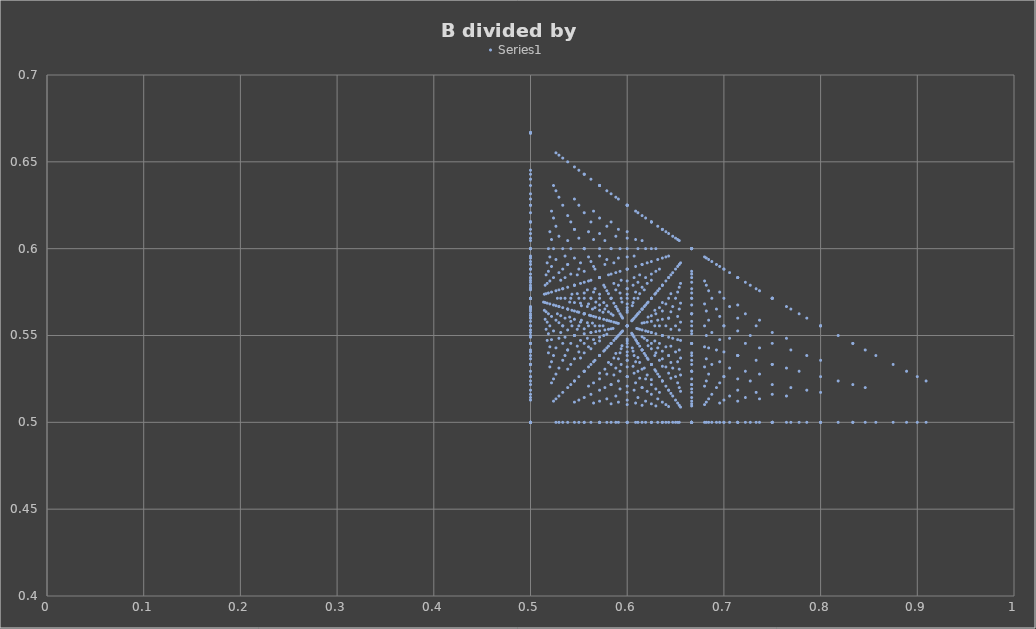
| Category | Series 0 |
|---|---|
| 0.5 | 0.667 |
| 0.6666666666666666 | 0.6 |
| 0.75 | 0.571 |
| 0.8 | 0.556 |
| 0.8333333333333334 | 0.545 |
| 0.8571428571428571 | 0.538 |
| 0.875 | 0.533 |
| 0.8888888888888888 | 0.529 |
| 0.9 | 0.526 |
| 0.9090909090909091 | 0.524 |
| 0.5 | 0.667 |
| 0.6 | 0.625 |
| 0.6666666666666666 | 0.6 |
| 0.7142857142857143 | 0.583 |
| 0.75 | 0.571 |
| 0.7777777777777778 | 0.562 |
| 0.8 | 0.556 |
| 0.8181818181818182 | 0.55 |
| 0.8333333333333334 | 0.545 |
| 0.8461538461538461 | 0.542 |
| 0.5 | 0.667 |
| 0.5714285714285714 | 0.636 |
| 0.625 | 0.615 |
| 0.6666666666666666 | 0.6 |
| 0.7 | 0.588 |
| 0.7272727272727273 | 0.579 |
| 0.75 | 0.571 |
| 0.7692307692307693 | 0.565 |
| 0.7857142857142857 | 0.56 |
| 0.8 | 0.556 |
| 0.5 | 0.667 |
| 0.5555555555555556 | 0.643 |
| 0.6 | 0.625 |
| 0.6363636363636364 | 0.611 |
| 0.6666666666666666 | 0.6 |
| 0.6923076923076923 | 0.591 |
| 0.7142857142857143 | 0.583 |
| 0.7333333333333333 | 0.577 |
| 0.75 | 0.571 |
| 0.7647058823529411 | 0.567 |
| 0.5 | 0.667 |
| 0.5454545454545454 | 0.647 |
| 0.5833333333333334 | 0.632 |
| 0.6153846153846154 | 0.619 |
| 0.6428571428571429 | 0.609 |
| 0.6666666666666666 | 0.6 |
| 0.6875 | 0.593 |
| 0.7058823529411765 | 0.586 |
| 0.7222222222222222 | 0.581 |
| 0.7368421052631579 | 0.576 |
| 0.5 | 0.667 |
| 0.5384615384615384 | 0.65 |
| 0.5714285714285714 | 0.636 |
| 0.6 | 0.625 |
| 0.625 | 0.615 |
| 0.6470588235294118 | 0.607 |
| 0.6666666666666666 | 0.6 |
| 0.6842105263157895 | 0.594 |
| 0.7 | 0.588 |
| 0.7142857142857143 | 0.583 |
| 0.5 | 0.667 |
| 0.5333333333333333 | 0.652 |
| 0.5625 | 0.64 |
| 0.5882352941176471 | 0.63 |
| 0.6111111111111112 | 0.621 |
| 0.631578947368421 | 0.613 |
| 0.65 | 0.606 |
| 0.6666666666666666 | 0.6 |
| 0.6818181818181818 | 0.595 |
| 0.6956521739130435 | 0.59 |
| 0.5 | 0.667 |
| 0.5294117647058824 | 0.654 |
| 0.5555555555555556 | 0.643 |
| 0.5789473684210527 | 0.633 |
| 0.6 | 0.625 |
| 0.6190476190476191 | 0.618 |
| 0.6363636363636364 | 0.611 |
| 0.6521739130434783 | 0.605 |
| 0.6666666666666666 | 0.6 |
| 0.68 | 0.595 |
| 0.5 | 0.667 |
| 0.5263157894736842 | 0.655 |
| 0.55 | 0.645 |
| 0.5714285714285714 | 0.636 |
| 0.5909090909090909 | 0.629 |
| 0.6086956521739131 | 0.622 |
| 0.625 | 0.615 |
| 0.64 | 0.61 |
| 0.6538461538461539 | 0.605 |
| 0.6666666666666666 | 0.6 |
| 0.5 | 0.5 |
| 0.6666666666666666 | 0.5 |
| 0.75 | 0.5 |
| 0.8 | 0.5 |
| 0.8333333333333334 | 0.5 |
| 0.8571428571428571 | 0.5 |
| 0.875 | 0.5 |
| 0.8888888888888888 | 0.5 |
| 0.9 | 0.5 |
| 0.9090909090909091 | 0.5 |
| 0.5 | 0.571 |
| 0.6 | 0.556 |
| 0.6666666666666666 | 0.545 |
| 0.7142857142857143 | 0.538 |
| 0.75 | 0.533 |
| 0.7777777777777778 | 0.529 |
| 0.8 | 0.526 |
| 0.8181818181818182 | 0.524 |
| 0.8333333333333334 | 0.522 |
| 0.8461538461538461 | 0.52 |
| 0.5 | 0.6 |
| 0.5714285714285714 | 0.583 |
| 0.625 | 0.571 |
| 0.6666666666666666 | 0.562 |
| 0.7 | 0.556 |
| 0.7272727272727273 | 0.55 |
| 0.75 | 0.545 |
| 0.7692307692307693 | 0.542 |
| 0.7857142857142857 | 0.538 |
| 0.8 | 0.536 |
| 0.5 | 0.615 |
| 0.5555555555555556 | 0.6 |
| 0.6 | 0.588 |
| 0.6363636363636364 | 0.579 |
| 0.6666666666666666 | 0.571 |
| 0.6923076923076923 | 0.565 |
| 0.7142857142857143 | 0.56 |
| 0.7333333333333333 | 0.556 |
| 0.75 | 0.552 |
| 0.7647058823529411 | 0.548 |
| 0.5 | 0.625 |
| 0.5454545454545454 | 0.611 |
| 0.5833333333333334 | 0.6 |
| 0.6153846153846154 | 0.591 |
| 0.6428571428571429 | 0.583 |
| 0.6666666666666666 | 0.577 |
| 0.6875 | 0.571 |
| 0.7058823529411765 | 0.567 |
| 0.7222222222222222 | 0.562 |
| 0.7368421052631579 | 0.559 |
| 0.5 | 0.632 |
| 0.5384615384615384 | 0.619 |
| 0.5714285714285714 | 0.609 |
| 0.6 | 0.6 |
| 0.625 | 0.593 |
| 0.6470588235294118 | 0.586 |
| 0.6666666666666666 | 0.581 |
| 0.6842105263157895 | 0.576 |
| 0.7 | 0.571 |
| 0.7142857142857143 | 0.568 |
| 0.5 | 0.636 |
| 0.5333333333333333 | 0.625 |
| 0.5625 | 0.615 |
| 0.5882352941176471 | 0.607 |
| 0.6111111111111112 | 0.6 |
| 0.631578947368421 | 0.594 |
| 0.65 | 0.588 |
| 0.6666666666666666 | 0.583 |
| 0.6818181818181818 | 0.579 |
| 0.6956521739130435 | 0.575 |
| 0.5 | 0.64 |
| 0.5294117647058824 | 0.63 |
| 0.5555555555555556 | 0.621 |
| 0.5789473684210527 | 0.613 |
| 0.6 | 0.606 |
| 0.6190476190476191 | 0.6 |
| 0.6363636363636364 | 0.595 |
| 0.6521739130434783 | 0.59 |
| 0.6666666666666666 | 0.585 |
| 0.68 | 0.581 |
| 0.5 | 0.643 |
| 0.5263157894736842 | 0.633 |
| 0.55 | 0.625 |
| 0.5714285714285714 | 0.618 |
| 0.5909090909090909 | 0.611 |
| 0.6086956521739131 | 0.605 |
| 0.625 | 0.6 |
| 0.64 | 0.595 |
| 0.6538461538461539 | 0.591 |
| 0.6666666666666666 | 0.587 |
| 0.5 | 0.645 |
| 0.5238095238095238 | 0.636 |
| 0.5454545454545454 | 0.629 |
| 0.5652173913043478 | 0.622 |
| 0.5833333333333334 | 0.615 |
| 0.6 | 0.61 |
| 0.6153846153846154 | 0.605 |
| 0.6296296296296297 | 0.6 |
| 0.6428571428571429 | 0.596 |
| 0.6551724137931034 | 0.592 |
| 0.5 | 0.5 |
| 0.6 | 0.5 |
| 0.6666666666666666 | 0.5 |
| 0.7142857142857143 | 0.5 |
| 0.75 | 0.5 |
| 0.7777777777777778 | 0.5 |
| 0.8 | 0.5 |
| 0.8181818181818182 | 0.5 |
| 0.8333333333333334 | 0.5 |
| 0.8461538461538461 | 0.5 |
| 0.5 | 0.545 |
| 0.5714285714285714 | 0.538 |
| 0.625 | 0.533 |
| 0.6666666666666666 | 0.529 |
| 0.7 | 0.526 |
| 0.7272727272727273 | 0.524 |
| 0.75 | 0.522 |
| 0.7692307692307693 | 0.52 |
| 0.7857142857142857 | 0.519 |
| 0.8 | 0.517 |
| 0.5 | 0.571 |
| 0.5555555555555556 | 0.562 |
| 0.6 | 0.556 |
| 0.6363636363636364 | 0.55 |
| 0.6666666666666666 | 0.545 |
| 0.6923076923076923 | 0.542 |
| 0.7142857142857143 | 0.538 |
| 0.7333333333333333 | 0.536 |
| 0.75 | 0.533 |
| 0.7647058823529411 | 0.531 |
| 0.5 | 0.588 |
| 0.5454545454545454 | 0.579 |
| 0.5833333333333334 | 0.571 |
| 0.6153846153846154 | 0.565 |
| 0.6428571428571429 | 0.56 |
| 0.6666666666666666 | 0.556 |
| 0.6875 | 0.552 |
| 0.7058823529411765 | 0.548 |
| 0.7222222222222222 | 0.545 |
| 0.7368421052631579 | 0.543 |
| 0.5 | 0.6 |
| 0.5384615384615384 | 0.591 |
| 0.5714285714285714 | 0.583 |
| 0.6 | 0.577 |
| 0.625 | 0.571 |
| 0.6470588235294118 | 0.567 |
| 0.6666666666666666 | 0.562 |
| 0.6842105263157895 | 0.559 |
| 0.7 | 0.556 |
| 0.7142857142857143 | 0.553 |
| 0.5 | 0.609 |
| 0.5333333333333333 | 0.6 |
| 0.5625 | 0.593 |
| 0.5882352941176471 | 0.586 |
| 0.6111111111111112 | 0.581 |
| 0.631578947368421 | 0.576 |
| 0.65 | 0.571 |
| 0.6666666666666666 | 0.568 |
| 0.6818181818181818 | 0.564 |
| 0.6956521739130435 | 0.561 |
| 0.5 | 0.615 |
| 0.5294117647058824 | 0.607 |
| 0.5555555555555556 | 0.6 |
| 0.5789473684210527 | 0.594 |
| 0.6 | 0.588 |
| 0.6190476190476191 | 0.583 |
| 0.6363636363636364 | 0.579 |
| 0.6521739130434783 | 0.575 |
| 0.6666666666666666 | 0.571 |
| 0.68 | 0.568 |
| 0.5 | 0.621 |
| 0.5263157894736842 | 0.613 |
| 0.55 | 0.606 |
| 0.5714285714285714 | 0.6 |
| 0.5909090909090909 | 0.595 |
| 0.6086956521739131 | 0.59 |
| 0.625 | 0.585 |
| 0.64 | 0.581 |
| 0.6538461538461539 | 0.578 |
| 0.6666666666666666 | 0.574 |
| 0.5 | 0.625 |
| 0.5238095238095238 | 0.618 |
| 0.5454545454545454 | 0.611 |
| 0.5652173913043478 | 0.605 |
| 0.5833333333333334 | 0.6 |
| 0.6 | 0.595 |
| 0.6153846153846154 | 0.591 |
| 0.6296296296296297 | 0.587 |
| 0.6428571428571429 | 0.583 |
| 0.6551724137931034 | 0.58 |
| 0.5 | 0.629 |
| 0.5217391304347826 | 0.622 |
| 0.5416666666666666 | 0.615 |
| 0.56 | 0.61 |
| 0.5769230769230769 | 0.605 |
| 0.5925925925925926 | 0.6 |
| 0.6071428571428571 | 0.596 |
| 0.6206896551724138 | 0.592 |
| 0.6333333333333333 | 0.588 |
| 0.6451612903225806 | 0.585 |
| 0.5 | 0.5 |
| 0.5714285714285714 | 0.5 |
| 0.625 | 0.5 |
| 0.6666666666666666 | 0.5 |
| 0.7 | 0.5 |
| 0.7272727272727273 | 0.5 |
| 0.75 | 0.5 |
| 0.7692307692307693 | 0.5 |
| 0.7857142857142857 | 0.5 |
| 0.8 | 0.5 |
| 0.5 | 0.533 |
| 0.5555555555555556 | 0.529 |
| 0.6 | 0.526 |
| 0.6363636363636364 | 0.524 |
| 0.6666666666666666 | 0.522 |
| 0.6923076923076923 | 0.52 |
| 0.7142857142857143 | 0.519 |
| 0.7333333333333333 | 0.517 |
| 0.75 | 0.516 |
| 0.7647058823529411 | 0.515 |
| 0.5 | 0.556 |
| 0.5454545454545454 | 0.55 |
| 0.5833333333333334 | 0.545 |
| 0.6153846153846154 | 0.542 |
| 0.6428571428571429 | 0.538 |
| 0.6666666666666666 | 0.536 |
| 0.6875 | 0.533 |
| 0.7058823529411765 | 0.531 |
| 0.7222222222222222 | 0.529 |
| 0.7368421052631579 | 0.528 |
| 0.5 | 0.571 |
| 0.5384615384615384 | 0.565 |
| 0.5714285714285714 | 0.56 |
| 0.6 | 0.556 |
| 0.625 | 0.552 |
| 0.6470588235294118 | 0.548 |
| 0.6666666666666666 | 0.545 |
| 0.6842105263157895 | 0.543 |
| 0.7 | 0.541 |
| 0.7142857142857143 | 0.538 |
| 0.5 | 0.583 |
| 0.5333333333333333 | 0.577 |
| 0.5625 | 0.571 |
| 0.5882352941176471 | 0.567 |
| 0.6111111111111112 | 0.562 |
| 0.631578947368421 | 0.559 |
| 0.65 | 0.556 |
| 0.6666666666666666 | 0.553 |
| 0.6818181818181818 | 0.55 |
| 0.6956521739130435 | 0.548 |
| 0.5 | 0.593 |
| 0.5294117647058824 | 0.586 |
| 0.5555555555555556 | 0.581 |
| 0.5789473684210527 | 0.576 |
| 0.6 | 0.571 |
| 0.6190476190476191 | 0.568 |
| 0.6363636363636364 | 0.564 |
| 0.6521739130434783 | 0.561 |
| 0.6666666666666666 | 0.558 |
| 0.68 | 0.556 |
| 0.5 | 0.6 |
| 0.5263157894736842 | 0.594 |
| 0.55 | 0.588 |
| 0.5714285714285714 | 0.583 |
| 0.5909090909090909 | 0.579 |
| 0.6086956521739131 | 0.575 |
| 0.625 | 0.571 |
| 0.64 | 0.568 |
| 0.6538461538461539 | 0.565 |
| 0.6666666666666666 | 0.562 |
| 0.5 | 0.606 |
| 0.5238095238095238 | 0.6 |
| 0.5454545454545454 | 0.595 |
| 0.5652173913043478 | 0.59 |
| 0.5833333333333334 | 0.585 |
| 0.6 | 0.581 |
| 0.6153846153846154 | 0.578 |
| 0.6296296296296297 | 0.574 |
| 0.6428571428571429 | 0.571 |
| 0.6551724137931034 | 0.569 |
| 0.5 | 0.611 |
| 0.5217391304347826 | 0.605 |
| 0.5416666666666666 | 0.6 |
| 0.56 | 0.595 |
| 0.5769230769230769 | 0.591 |
| 0.5925925925925926 | 0.587 |
| 0.6071428571428571 | 0.583 |
| 0.6206896551724138 | 0.58 |
| 0.6333333333333333 | 0.577 |
| 0.6451612903225806 | 0.574 |
| 0.5 | 0.615 |
| 0.52 | 0.61 |
| 0.5384615384615384 | 0.605 |
| 0.5555555555555556 | 0.6 |
| 0.5714285714285714 | 0.596 |
| 0.5862068965517241 | 0.592 |
| 0.6 | 0.588 |
| 0.6129032258064516 | 0.585 |
| 0.625 | 0.582 |
| 0.6363636363636364 | 0.579 |
| 0.5 | 0.5 |
| 0.5555555555555556 | 0.5 |
| 0.6 | 0.5 |
| 0.6363636363636364 | 0.5 |
| 0.6666666666666666 | 0.5 |
| 0.6923076923076923 | 0.5 |
| 0.7142857142857143 | 0.5 |
| 0.7333333333333333 | 0.5 |
| 0.75 | 0.5 |
| 0.7647058823529411 | 0.5 |
| 0.5 | 0.526 |
| 0.5454545454545454 | 0.524 |
| 0.5833333333333334 | 0.522 |
| 0.6153846153846154 | 0.52 |
| 0.6428571428571429 | 0.519 |
| 0.6666666666666666 | 0.517 |
| 0.6875 | 0.516 |
| 0.7058823529411765 | 0.515 |
| 0.7222222222222222 | 0.514 |
| 0.7368421052631579 | 0.514 |
| 0.5 | 0.545 |
| 0.5384615384615384 | 0.542 |
| 0.5714285714285714 | 0.538 |
| 0.6 | 0.536 |
| 0.625 | 0.533 |
| 0.6470588235294118 | 0.531 |
| 0.6666666666666666 | 0.529 |
| 0.6842105263157895 | 0.528 |
| 0.7 | 0.526 |
| 0.7142857142857143 | 0.525 |
| 0.5 | 0.56 |
| 0.5333333333333333 | 0.556 |
| 0.5625 | 0.552 |
| 0.5882352941176471 | 0.548 |
| 0.6111111111111112 | 0.545 |
| 0.631578947368421 | 0.543 |
| 0.65 | 0.541 |
| 0.6666666666666666 | 0.538 |
| 0.6818181818181818 | 0.537 |
| 0.6956521739130435 | 0.535 |
| 0.5 | 0.571 |
| 0.5294117647058824 | 0.567 |
| 0.5555555555555556 | 0.562 |
| 0.5789473684210527 | 0.559 |
| 0.6 | 0.556 |
| 0.6190476190476191 | 0.553 |
| 0.6363636363636364 | 0.55 |
| 0.6521739130434783 | 0.548 |
| 0.6666666666666666 | 0.545 |
| 0.68 | 0.543 |
| 0.5 | 0.581 |
| 0.5263157894736842 | 0.576 |
| 0.55 | 0.571 |
| 0.5714285714285714 | 0.568 |
| 0.5909090909090909 | 0.564 |
| 0.6086956521739131 | 0.561 |
| 0.625 | 0.558 |
| 0.64 | 0.556 |
| 0.6538461538461539 | 0.553 |
| 0.6666666666666666 | 0.551 |
| 0.5 | 0.588 |
| 0.5238095238095238 | 0.583 |
| 0.5454545454545454 | 0.579 |
| 0.5652173913043478 | 0.575 |
| 0.5833333333333334 | 0.571 |
| 0.6 | 0.568 |
| 0.6153846153846154 | 0.565 |
| 0.6296296296296297 | 0.562 |
| 0.6428571428571429 | 0.56 |
| 0.6551724137931034 | 0.558 |
| 0.5 | 0.595 |
| 0.5217391304347826 | 0.59 |
| 0.5416666666666666 | 0.585 |
| 0.56 | 0.581 |
| 0.5769230769230769 | 0.578 |
| 0.5925925925925926 | 0.574 |
| 0.6071428571428571 | 0.571 |
| 0.6206896551724138 | 0.569 |
| 0.6333333333333333 | 0.566 |
| 0.6451612903225806 | 0.564 |
| 0.5 | 0.6 |
| 0.52 | 0.595 |
| 0.5384615384615384 | 0.591 |
| 0.5555555555555556 | 0.587 |
| 0.5714285714285714 | 0.583 |
| 0.5862068965517241 | 0.58 |
| 0.6 | 0.577 |
| 0.6129032258064516 | 0.574 |
| 0.625 | 0.571 |
| 0.6363636363636364 | 0.569 |
| 0.5 | 0.605 |
| 0.5185185185185185 | 0.6 |
| 0.5357142857142857 | 0.596 |
| 0.5517241379310345 | 0.592 |
| 0.5666666666666667 | 0.588 |
| 0.5806451612903226 | 0.585 |
| 0.59375 | 0.582 |
| 0.6060606060606061 | 0.579 |
| 0.6176470588235294 | 0.576 |
| 0.6285714285714286 | 0.574 |
| 0.5 | 0.5 |
| 0.5454545454545454 | 0.5 |
| 0.5833333333333334 | 0.5 |
| 0.6153846153846154 | 0.5 |
| 0.6428571428571429 | 0.5 |
| 0.6666666666666666 | 0.5 |
| 0.6875 | 0.5 |
| 0.7058823529411765 | 0.5 |
| 0.7222222222222222 | 0.5 |
| 0.7368421052631579 | 0.5 |
| 0.5 | 0.522 |
| 0.5384615384615384 | 0.52 |
| 0.5714285714285714 | 0.519 |
| 0.6 | 0.517 |
| 0.625 | 0.516 |
| 0.6470588235294118 | 0.515 |
| 0.6666666666666666 | 0.514 |
| 0.6842105263157895 | 0.514 |
| 0.7 | 0.513 |
| 0.7142857142857143 | 0.512 |
| 0.5 | 0.538 |
| 0.5333333333333333 | 0.536 |
| 0.5625 | 0.533 |
| 0.5882352941176471 | 0.531 |
| 0.6111111111111112 | 0.529 |
| 0.631578947368421 | 0.528 |
| 0.65 | 0.526 |
| 0.6666666666666666 | 0.525 |
| 0.6818181818181818 | 0.524 |
| 0.6956521739130435 | 0.523 |
| 0.5 | 0.552 |
| 0.5294117647058824 | 0.548 |
| 0.5555555555555556 | 0.545 |
| 0.5789473684210527 | 0.543 |
| 0.6 | 0.541 |
| 0.6190476190476191 | 0.538 |
| 0.6363636363636364 | 0.537 |
| 0.6521739130434783 | 0.535 |
| 0.6666666666666666 | 0.533 |
| 0.68 | 0.532 |
| 0.5 | 0.562 |
| 0.5263157894736842 | 0.559 |
| 0.55 | 0.556 |
| 0.5714285714285714 | 0.553 |
| 0.5909090909090909 | 0.55 |
| 0.6086956521739131 | 0.548 |
| 0.625 | 0.545 |
| 0.64 | 0.543 |
| 0.6538461538461539 | 0.542 |
| 0.6666666666666666 | 0.54 |
| 0.5 | 0.571 |
| 0.5238095238095238 | 0.568 |
| 0.5454545454545454 | 0.564 |
| 0.5652173913043478 | 0.561 |
| 0.5833333333333334 | 0.558 |
| 0.6 | 0.556 |
| 0.6153846153846154 | 0.553 |
| 0.6296296296296297 | 0.551 |
| 0.6428571428571429 | 0.549 |
| 0.6551724137931034 | 0.547 |
| 0.5 | 0.579 |
| 0.5217391304347826 | 0.575 |
| 0.5416666666666666 | 0.571 |
| 0.56 | 0.568 |
| 0.5769230769230769 | 0.565 |
| 0.5925925925925926 | 0.562 |
| 0.6071428571428571 | 0.56 |
| 0.6206896551724138 | 0.558 |
| 0.6333333333333333 | 0.556 |
| 0.6451612903225806 | 0.554 |
| 0.5 | 0.585 |
| 0.52 | 0.581 |
| 0.5384615384615384 | 0.578 |
| 0.5555555555555556 | 0.574 |
| 0.5714285714285714 | 0.571 |
| 0.5862068965517241 | 0.569 |
| 0.6 | 0.566 |
| 0.6129032258064516 | 0.564 |
| 0.625 | 0.561 |
| 0.6363636363636364 | 0.559 |
| 0.5 | 0.591 |
| 0.5185185185185185 | 0.587 |
| 0.5357142857142857 | 0.583 |
| 0.5517241379310345 | 0.58 |
| 0.5666666666666667 | 0.577 |
| 0.5806451612903226 | 0.574 |
| 0.59375 | 0.571 |
| 0.6060606060606061 | 0.569 |
| 0.6176470588235294 | 0.567 |
| 0.6285714285714286 | 0.565 |
| 0.5 | 0.596 |
| 0.5172413793103449 | 0.592 |
| 0.5333333333333333 | 0.588 |
| 0.5483870967741935 | 0.585 |
| 0.5625 | 0.582 |
| 0.5757575757575758 | 0.579 |
| 0.5882352941176471 | 0.576 |
| 0.6 | 0.574 |
| 0.6111111111111112 | 0.571 |
| 0.6216216216216216 | 0.569 |
| 0.5 | 0.5 |
| 0.5384615384615384 | 0.5 |
| 0.5714285714285714 | 0.5 |
| 0.6 | 0.5 |
| 0.625 | 0.5 |
| 0.6470588235294118 | 0.5 |
| 0.6666666666666666 | 0.5 |
| 0.6842105263157895 | 0.5 |
| 0.7 | 0.5 |
| 0.7142857142857143 | 0.5 |
| 0.5 | 0.519 |
| 0.5333333333333333 | 0.517 |
| 0.5625 | 0.516 |
| 0.5882352941176471 | 0.515 |
| 0.6111111111111112 | 0.514 |
| 0.631578947368421 | 0.514 |
| 0.65 | 0.513 |
| 0.6666666666666666 | 0.512 |
| 0.6818181818181818 | 0.512 |
| 0.6956521739130435 | 0.511 |
| 0.5 | 0.533 |
| 0.5294117647058824 | 0.531 |
| 0.5555555555555556 | 0.529 |
| 0.5789473684210527 | 0.528 |
| 0.6 | 0.526 |
| 0.6190476190476191 | 0.525 |
| 0.6363636363636364 | 0.524 |
| 0.6521739130434783 | 0.523 |
| 0.6666666666666666 | 0.522 |
| 0.68 | 0.521 |
| 0.5 | 0.545 |
| 0.5263157894736842 | 0.543 |
| 0.55 | 0.541 |
| 0.5714285714285714 | 0.538 |
| 0.5909090909090909 | 0.537 |
| 0.6086956521739131 | 0.535 |
| 0.625 | 0.533 |
| 0.64 | 0.532 |
| 0.6538461538461539 | 0.531 |
| 0.6666666666666666 | 0.529 |
| 0.5 | 0.556 |
| 0.5238095238095238 | 0.553 |
| 0.5454545454545454 | 0.55 |
| 0.5652173913043478 | 0.548 |
| 0.5833333333333334 | 0.545 |
| 0.6 | 0.543 |
| 0.6153846153846154 | 0.542 |
| 0.6296296296296297 | 0.54 |
| 0.6428571428571429 | 0.538 |
| 0.6551724137931034 | 0.537 |
| 0.5 | 0.564 |
| 0.5217391304347826 | 0.561 |
| 0.5416666666666666 | 0.558 |
| 0.56 | 0.556 |
| 0.5769230769230769 | 0.553 |
| 0.5925925925925926 | 0.551 |
| 0.6071428571428571 | 0.549 |
| 0.6206896551724138 | 0.547 |
| 0.6333333333333333 | 0.545 |
| 0.6451612903225806 | 0.544 |
| 0.5 | 0.571 |
| 0.52 | 0.568 |
| 0.5384615384615384 | 0.565 |
| 0.5555555555555556 | 0.562 |
| 0.5714285714285714 | 0.56 |
| 0.5862068965517241 | 0.558 |
| 0.6 | 0.556 |
| 0.6129032258064516 | 0.554 |
| 0.625 | 0.552 |
| 0.6363636363636364 | 0.55 |
| 0.5 | 0.578 |
| 0.5185185185185185 | 0.574 |
| 0.5357142857142857 | 0.571 |
| 0.5517241379310345 | 0.569 |
| 0.5666666666666667 | 0.566 |
| 0.5806451612903226 | 0.564 |
| 0.59375 | 0.561 |
| 0.6060606060606061 | 0.559 |
| 0.6176470588235294 | 0.557 |
| 0.6285714285714286 | 0.556 |
| 0.5 | 0.583 |
| 0.5172413793103449 | 0.58 |
| 0.5333333333333333 | 0.577 |
| 0.5483870967741935 | 0.574 |
| 0.5625 | 0.571 |
| 0.5757575757575758 | 0.569 |
| 0.5882352941176471 | 0.567 |
| 0.6 | 0.565 |
| 0.6111111111111112 | 0.562 |
| 0.6216216216216216 | 0.561 |
| 0.5 | 0.588 |
| 0.5161290322580645 | 0.585 |
| 0.53125 | 0.582 |
| 0.5454545454545454 | 0.579 |
| 0.5588235294117647 | 0.576 |
| 0.5714285714285714 | 0.574 |
| 0.5833333333333334 | 0.571 |
| 0.5945945945945946 | 0.569 |
| 0.6052631578947368 | 0.567 |
| 0.6153846153846154 | 0.565 |
| 0.5 | 0.5 |
| 0.5333333333333333 | 0.5 |
| 0.5625 | 0.5 |
| 0.5882352941176471 | 0.5 |
| 0.6111111111111112 | 0.5 |
| 0.631578947368421 | 0.5 |
| 0.65 | 0.5 |
| 0.6666666666666666 | 0.5 |
| 0.6818181818181818 | 0.5 |
| 0.6956521739130435 | 0.5 |
| 0.5 | 0.516 |
| 0.5294117647058824 | 0.515 |
| 0.5555555555555556 | 0.514 |
| 0.5789473684210527 | 0.514 |
| 0.6 | 0.513 |
| 0.6190476190476191 | 0.512 |
| 0.6363636363636364 | 0.512 |
| 0.6521739130434783 | 0.511 |
| 0.6666666666666666 | 0.511 |
| 0.68 | 0.51 |
| 0.5 | 0.529 |
| 0.5263157894736842 | 0.528 |
| 0.55 | 0.526 |
| 0.5714285714285714 | 0.525 |
| 0.5909090909090909 | 0.524 |
| 0.6086956521739131 | 0.523 |
| 0.625 | 0.522 |
| 0.64 | 0.521 |
| 0.6538461538461539 | 0.52 |
| 0.6666666666666666 | 0.519 |
| 0.5 | 0.541 |
| 0.5238095238095238 | 0.538 |
| 0.5454545454545454 | 0.537 |
| 0.5652173913043478 | 0.535 |
| 0.5833333333333334 | 0.533 |
| 0.6 | 0.532 |
| 0.6153846153846154 | 0.531 |
| 0.6296296296296297 | 0.529 |
| 0.6428571428571429 | 0.528 |
| 0.6551724137931034 | 0.527 |
| 0.5 | 0.55 |
| 0.5217391304347826 | 0.548 |
| 0.5416666666666666 | 0.545 |
| 0.56 | 0.543 |
| 0.5769230769230769 | 0.542 |
| 0.5925925925925926 | 0.54 |
| 0.6071428571428571 | 0.538 |
| 0.6206896551724138 | 0.537 |
| 0.6333333333333333 | 0.536 |
| 0.6451612903225806 | 0.534 |
| 0.5 | 0.558 |
| 0.52 | 0.556 |
| 0.5384615384615384 | 0.553 |
| 0.5555555555555556 | 0.551 |
| 0.5714285714285714 | 0.549 |
| 0.5862068965517241 | 0.547 |
| 0.6 | 0.545 |
| 0.6129032258064516 | 0.544 |
| 0.625 | 0.542 |
| 0.6363636363636364 | 0.541 |
| 0.5 | 0.565 |
| 0.5185185185185185 | 0.562 |
| 0.5357142857142857 | 0.56 |
| 0.5517241379310345 | 0.558 |
| 0.5666666666666667 | 0.556 |
| 0.5806451612903226 | 0.554 |
| 0.59375 | 0.552 |
| 0.6060606060606061 | 0.55 |
| 0.6176470588235294 | 0.548 |
| 0.6285714285714286 | 0.547 |
| 0.5 | 0.571 |
| 0.5172413793103449 | 0.569 |
| 0.5333333333333333 | 0.566 |
| 0.5483870967741935 | 0.564 |
| 0.5625 | 0.561 |
| 0.5757575757575758 | 0.559 |
| 0.5882352941176471 | 0.557 |
| 0.6 | 0.556 |
| 0.6111111111111112 | 0.554 |
| 0.6216216216216216 | 0.552 |
| 0.5 | 0.577 |
| 0.5161290322580645 | 0.574 |
| 0.53125 | 0.571 |
| 0.5454545454545454 | 0.569 |
| 0.5588235294117647 | 0.567 |
| 0.5714285714285714 | 0.565 |
| 0.5833333333333334 | 0.562 |
| 0.5945945945945946 | 0.561 |
| 0.6052631578947368 | 0.559 |
| 0.6153846153846154 | 0.557 |
| 0.5 | 0.582 |
| 0.5151515151515151 | 0.579 |
| 0.5294117647058824 | 0.576 |
| 0.5428571428571428 | 0.574 |
| 0.5555555555555556 | 0.571 |
| 0.5675675675675675 | 0.569 |
| 0.5789473684210527 | 0.567 |
| 0.5897435897435898 | 0.565 |
| 0.6 | 0.563 |
| 0.6097560975609756 | 0.562 |
| 0.5 | 0.5 |
| 0.5294117647058824 | 0.5 |
| 0.5555555555555556 | 0.5 |
| 0.5789473684210527 | 0.5 |
| 0.6 | 0.5 |
| 0.6190476190476191 | 0.5 |
| 0.6363636363636364 | 0.5 |
| 0.6521739130434783 | 0.5 |
| 0.6666666666666666 | 0.5 |
| 0.68 | 0.5 |
| 0.5 | 0.514 |
| 0.5263157894736842 | 0.514 |
| 0.55 | 0.513 |
| 0.5714285714285714 | 0.512 |
| 0.5909090909090909 | 0.512 |
| 0.6086956521739131 | 0.511 |
| 0.625 | 0.511 |
| 0.64 | 0.51 |
| 0.6538461538461539 | 0.51 |
| 0.6666666666666666 | 0.509 |
| 0.5 | 0.526 |
| 0.5238095238095238 | 0.525 |
| 0.5454545454545454 | 0.524 |
| 0.5652173913043478 | 0.523 |
| 0.5833333333333334 | 0.522 |
| 0.6 | 0.521 |
| 0.6153846153846154 | 0.52 |
| 0.6296296296296297 | 0.519 |
| 0.6428571428571429 | 0.519 |
| 0.6551724137931034 | 0.518 |
| 0.5 | 0.537 |
| 0.5217391304347826 | 0.535 |
| 0.5416666666666666 | 0.533 |
| 0.56 | 0.532 |
| 0.5769230769230769 | 0.531 |
| 0.5925925925925926 | 0.529 |
| 0.6071428571428571 | 0.528 |
| 0.6206896551724138 | 0.527 |
| 0.6333333333333333 | 0.526 |
| 0.6451612903225806 | 0.525 |
| 0.5 | 0.545 |
| 0.52 | 0.543 |
| 0.5384615384615384 | 0.542 |
| 0.5555555555555556 | 0.54 |
| 0.5714285714285714 | 0.538 |
| 0.5862068965517241 | 0.537 |
| 0.6 | 0.536 |
| 0.6129032258064516 | 0.534 |
| 0.625 | 0.533 |
| 0.6363636363636364 | 0.532 |
| 0.5 | 0.553 |
| 0.5185185185185185 | 0.551 |
| 0.5357142857142857 | 0.549 |
| 0.5517241379310345 | 0.547 |
| 0.5666666666666667 | 0.545 |
| 0.5806451612903226 | 0.544 |
| 0.59375 | 0.542 |
| 0.6060606060606061 | 0.541 |
| 0.6176470588235294 | 0.54 |
| 0.6285714285714286 | 0.538 |
| 0.5 | 0.56 |
| 0.5172413793103449 | 0.558 |
| 0.5333333333333333 | 0.556 |
| 0.5483870967741935 | 0.554 |
| 0.5625 | 0.552 |
| 0.5757575757575758 | 0.55 |
| 0.5882352941176471 | 0.548 |
| 0.6 | 0.547 |
| 0.6111111111111112 | 0.545 |
| 0.6216216216216216 | 0.544 |
| 0.5 | 0.566 |
| 0.5161290322580645 | 0.564 |
| 0.53125 | 0.561 |
| 0.5454545454545454 | 0.559 |
| 0.5588235294117647 | 0.557 |
| 0.5714285714285714 | 0.556 |
| 0.5833333333333334 | 0.554 |
| 0.5945945945945946 | 0.552 |
| 0.6052631578947368 | 0.551 |
| 0.6153846153846154 | 0.549 |
| 0.5 | 0.571 |
| 0.5151515151515151 | 0.569 |
| 0.5294117647058824 | 0.567 |
| 0.5428571428571428 | 0.565 |
| 0.5555555555555556 | 0.562 |
| 0.5675675675675675 | 0.561 |
| 0.5789473684210527 | 0.559 |
| 0.5897435897435898 | 0.557 |
| 0.6 | 0.556 |
| 0.6097560975609756 | 0.554 |
| 0.5 | 0.576 |
| 0.5142857142857142 | 0.574 |
| 0.5277777777777778 | 0.571 |
| 0.5405405405405406 | 0.569 |
| 0.5526315789473685 | 0.567 |
| 0.5641025641025641 | 0.565 |
| 0.575 | 0.563 |
| 0.5853658536585366 | 0.562 |
| 0.5952380952380952 | 0.56 |
| 0.6046511627906976 | 0.558 |
| 0.5 | 0.5 |
| 0.5263157894736842 | 0.5 |
| 0.55 | 0.5 |
| 0.5714285714285714 | 0.5 |
| 0.5909090909090909 | 0.5 |
| 0.6086956521739131 | 0.5 |
| 0.625 | 0.5 |
| 0.64 | 0.5 |
| 0.6538461538461539 | 0.5 |
| 0.6666666666666666 | 0.5 |
| 0.5 | 0.513 |
| 0.5238095238095238 | 0.512 |
| 0.5454545454545454 | 0.512 |
| 0.5652173913043478 | 0.511 |
| 0.5833333333333334 | 0.511 |
| 0.6 | 0.51 |
| 0.6153846153846154 | 0.51 |
| 0.6296296296296297 | 0.509 |
| 0.6428571428571429 | 0.509 |
| 0.6551724137931034 | 0.509 |
| 0.5 | 0.524 |
| 0.5217391304347826 | 0.523 |
| 0.5416666666666666 | 0.522 |
| 0.56 | 0.521 |
| 0.5769230769230769 | 0.52 |
| 0.5925925925925926 | 0.519 |
| 0.6071428571428571 | 0.519 |
| 0.6206896551724138 | 0.518 |
| 0.6333333333333333 | 0.517 |
| 0.6451612903225806 | 0.517 |
| 0.5 | 0.533 |
| 0.52 | 0.532 |
| 0.5384615384615384 | 0.531 |
| 0.5555555555555556 | 0.529 |
| 0.5714285714285714 | 0.528 |
| 0.5862068965517241 | 0.527 |
| 0.6 | 0.526 |
| 0.6129032258064516 | 0.525 |
| 0.625 | 0.525 |
| 0.6363636363636364 | 0.524 |
| 0.5 | 0.542 |
| 0.5185185185185185 | 0.54 |
| 0.5357142857142857 | 0.538 |
| 0.5517241379310345 | 0.537 |
| 0.5666666666666667 | 0.536 |
| 0.5806451612903226 | 0.534 |
| 0.59375 | 0.533 |
| 0.6060606060606061 | 0.532 |
| 0.6176470588235294 | 0.531 |
| 0.6285714285714286 | 0.53 |
| 0.5 | 0.549 |
| 0.5172413793103449 | 0.547 |
| 0.5333333333333333 | 0.545 |
| 0.5483870967741935 | 0.544 |
| 0.5625 | 0.542 |
| 0.5757575757575758 | 0.541 |
| 0.5882352941176471 | 0.54 |
| 0.6 | 0.538 |
| 0.6111111111111112 | 0.537 |
| 0.6216216216216216 | 0.536 |
| 0.5 | 0.556 |
| 0.5161290322580645 | 0.554 |
| 0.53125 | 0.552 |
| 0.5454545454545454 | 0.55 |
| 0.5588235294117647 | 0.548 |
| 0.5714285714285714 | 0.547 |
| 0.5833333333333334 | 0.545 |
| 0.5945945945945946 | 0.544 |
| 0.6052631578947368 | 0.543 |
| 0.6153846153846154 | 0.542 |
| 0.5 | 0.561 |
| 0.5151515151515151 | 0.559 |
| 0.5294117647058824 | 0.557 |
| 0.5428571428571428 | 0.556 |
| 0.5555555555555556 | 0.554 |
| 0.5675675675675675 | 0.552 |
| 0.5789473684210527 | 0.551 |
| 0.5897435897435898 | 0.549 |
| 0.6 | 0.548 |
| 0.6097560975609756 | 0.547 |
| 0.5 | 0.567 |
| 0.5142857142857142 | 0.565 |
| 0.5277777777777778 | 0.562 |
| 0.5405405405405406 | 0.561 |
| 0.5526315789473685 | 0.559 |
| 0.5641025641025641 | 0.557 |
| 0.575 | 0.556 |
| 0.5853658536585366 | 0.554 |
| 0.5952380952380952 | 0.553 |
| 0.6046511627906976 | 0.551 |
| 0.5 | 0.571 |
| 0.5135135135135135 | 0.569 |
| 0.5263157894736842 | 0.567 |
| 0.5384615384615384 | 0.565 |
| 0.55 | 0.563 |
| 0.5609756097560976 | 0.562 |
| 0.5714285714285714 | 0.56 |
| 0.5813953488372093 | 0.558 |
| 0.5909090909090909 | 0.557 |
| 0.6 | 0.556 |